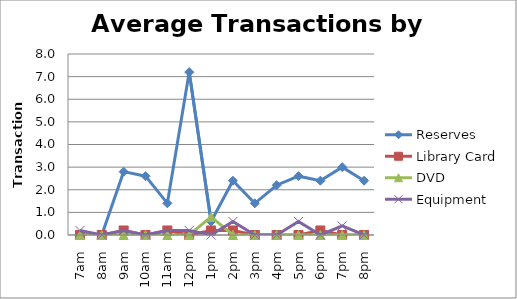
| Category | Reserves | Library Card | DVD | Equipment |
|---|---|---|---|---|
| 7am | 0 | 0 | 0 | 0.2 |
| 8am | 0 | 0 | 0 | 0 |
| 9am | 2.8 | 0.2 | 0 | 0.2 |
| 10am | 2.6 | 0 | 0 | 0 |
| 11am | 1.4 | 0.2 | 0 | 0.2 |
| 12pm | 7.2 | 0 | 0 | 0.2 |
| 1pm | 0.6 | 0.2 | 0.8 | 0 |
| 2pm | 2.4 | 0.2 | 0 | 0.6 |
| 3pm | 1.4 | 0 | 0 | 0 |
| 4pm | 2.2 | 0 | 0 | 0 |
| 5pm | 2.6 | 0 | 0 | 0.6 |
| 6pm | 2.4 | 0.2 | 0 | 0 |
| 7pm | 3 | 0 | 0 | 0.4 |
| 8pm | 2.4 | 0 | 0 | 0 |